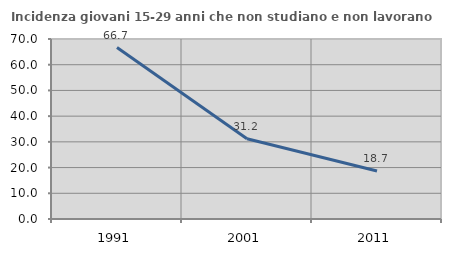
| Category | Incidenza giovani 15-29 anni che non studiano e non lavorano  |
|---|---|
| 1991.0 | 66.667 |
| 2001.0 | 31.21 |
| 2011.0 | 18.69 |